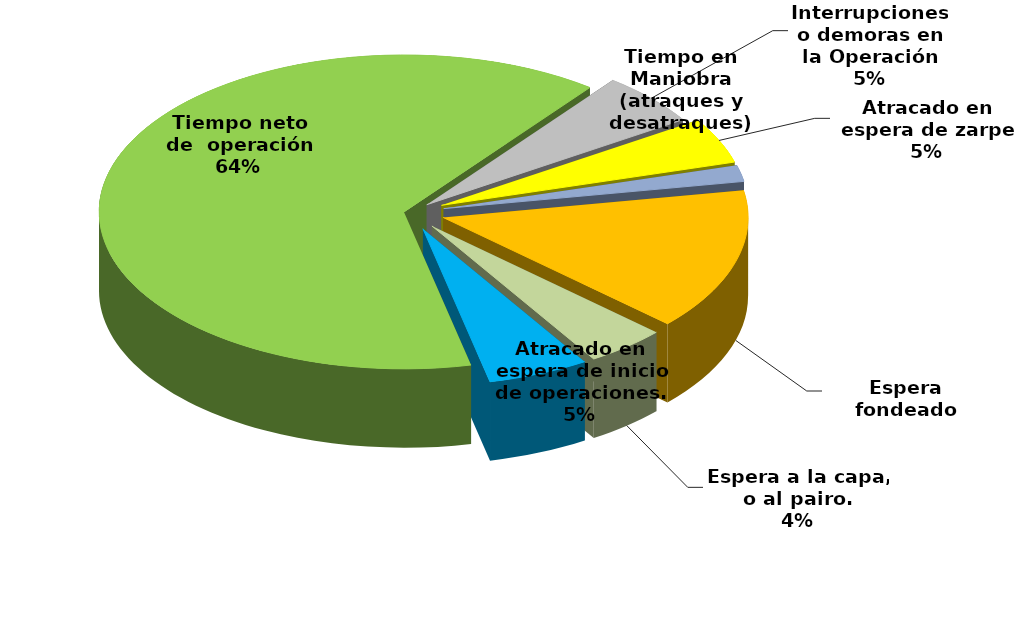
| Category | Series 0 |
|---|---|
| Espera fondeado | 27885.177 |
| Espera a la capa, o al pairo. | 8124.683 |
| Atracado en espera de inicio de operaciones. | 10244.244 |
| Tiempo neto de  operación | 122018.184 |
| Interrupciones o demoras en la Operación | 10392.04 |
| Atracado en espera de zarpe | 8909.309 |
| Tiempo en Maniobra (atraques y desatraques) | 3188.8 |